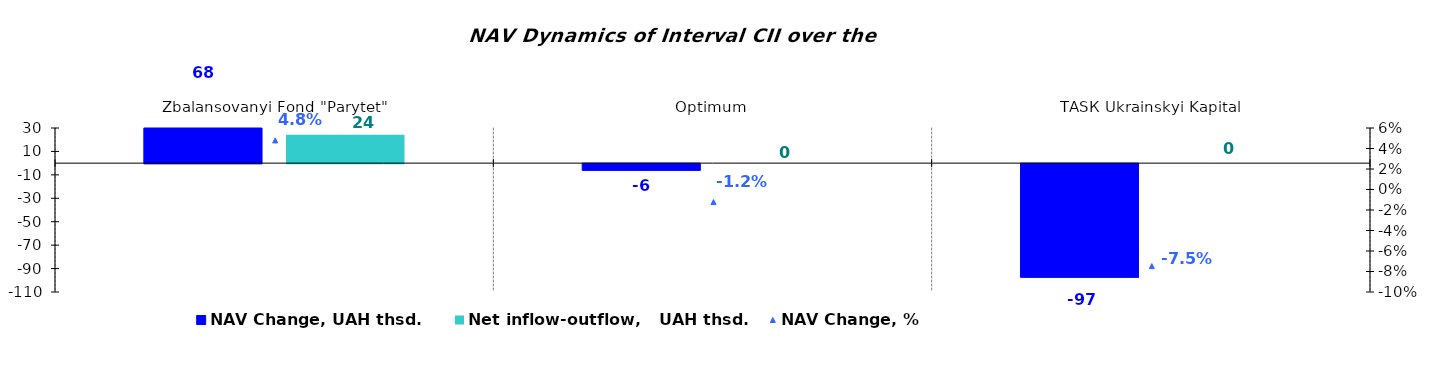
| Category | NAV Change, UAH thsd. | Net inflow-outflow,   UAH thsd. |
|---|---|---|
| Zbalansovanyi Fond "Parytet" | 68.188 | 24.137 |
| Оptimum | -5.68 | 0 |
| ТАSК Ukrainskyi Kapital | -96.898 | 0 |